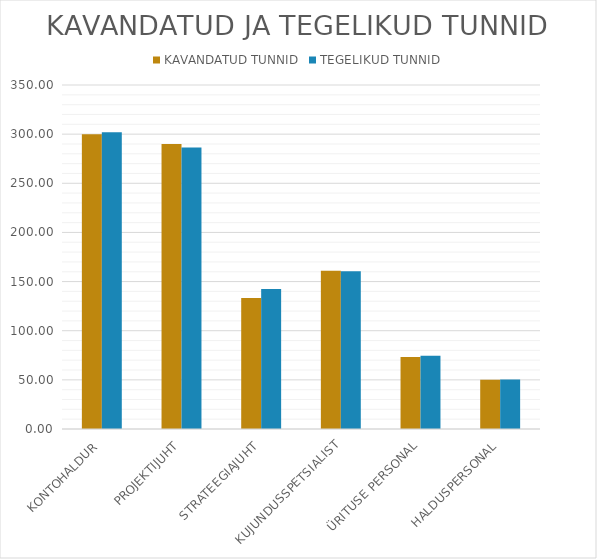
| Category | KAVANDATUD TUNNID | TEGELIKUD TUNNID |
|---|---|---|
| KONTOHALDUR | 300 | 302 |
| PROJEKTIJUHT | 290 | 286.333 |
| STRATEEGIAJUHT | 133.333 | 142.5 |
| KUJUNDUSSPETSIALIST | 161.111 | 160.556 |
| ÜRITUSE PERSONAL | 73.333 | 74.444 |
| HALDUSPERSONAL | 50 | 50.333 |